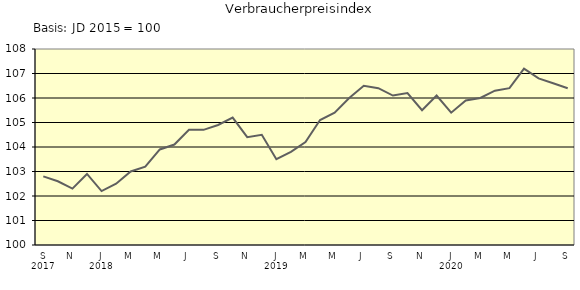
| Category | Series 0 |
|---|---|
| 0 | 102.8 |
| 1 | 102.6 |
| 2 | 102.3 |
| 3 | 102.9 |
| 4 | 102.2 |
| 5 | 102.5 |
| 6 | 103 |
| 7 | 103.2 |
| 8 | 103.9 |
| 9 | 104.1 |
| 10 | 104.7 |
| 11 | 104.7 |
| 12 | 104.9 |
| 13 | 105.2 |
| 14 | 104.4 |
| 15 | 104.5 |
| 16 | 103.5 |
| 17 | 103.8 |
| 18 | 104.2 |
| 19 | 105.1 |
| 20 | 105.4 |
| 21 | 106 |
| 22 | 106.5 |
| 23 | 106.4 |
| 24 | 106.1 |
| 25 | 106.2 |
| 26 | 105.5 |
| 27 | 106.1 |
| 28 | 105.4 |
| 29 | 105.9 |
| 30 | 106 |
| 31 | 106.3 |
| 32 | 106.4 |
| 33 | 107.2 |
| 34 | 106.8 |
| 35 | 106.6 |
| 36 | 106.4 |